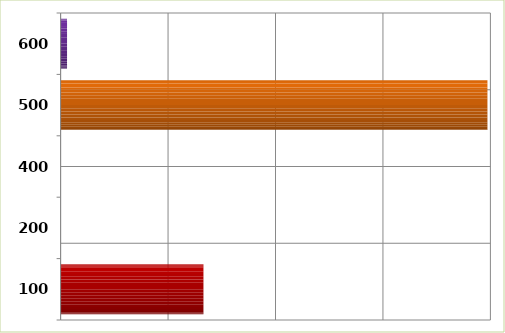
| Category | Series 0 |
|---|---|
| 100.0 | 26588113 |
| 200.0 | 0 |
| 400.0 | 0 |
| 500.0 | 79448669 |
| 600.0 | 1200000 |